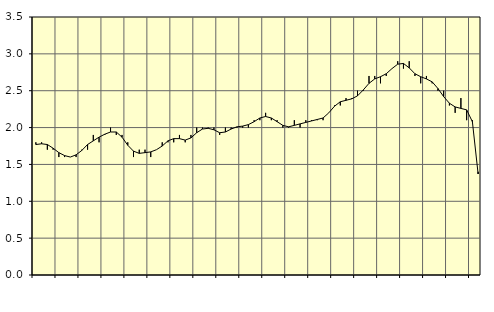
| Category | Piggar | Series 1 |
|---|---|---|
| nan | 1.8 | 1.77 |
| 1.0 | 1.8 | 1.78 |
| 1.0 | 1.7 | 1.77 |
| 1.0 | 1.7 | 1.72 |
| nan | 1.6 | 1.66 |
| 2.0 | 1.6 | 1.62 |
| 2.0 | 1.6 | 1.6 |
| 2.0 | 1.6 | 1.63 |
| nan | 1.7 | 1.69 |
| 3.0 | 1.7 | 1.77 |
| 3.0 | 1.9 | 1.82 |
| 3.0 | 1.8 | 1.87 |
| nan | 1.9 | 1.91 |
| 4.0 | 2 | 1.94 |
| 4.0 | 1.9 | 1.94 |
| 4.0 | 1.9 | 1.87 |
| nan | 1.8 | 1.76 |
| 5.0 | 1.6 | 1.68 |
| 5.0 | 1.7 | 1.65 |
| 5.0 | 1.7 | 1.66 |
| nan | 1.6 | 1.67 |
| 6.0 | 1.7 | 1.7 |
| 6.0 | 1.8 | 1.75 |
| 6.0 | 1.8 | 1.82 |
| nan | 1.8 | 1.85 |
| 7.0 | 1.9 | 1.85 |
| 7.0 | 1.8 | 1.83 |
| 7.0 | 1.9 | 1.86 |
| nan | 2 | 1.93 |
| 8.0 | 2 | 1.98 |
| 8.0 | 2 | 1.99 |
| 8.0 | 2 | 1.97 |
| nan | 1.9 | 1.93 |
| 9.0 | 2 | 1.94 |
| 9.0 | 2 | 1.98 |
| 9.0 | 2 | 2.01 |
| nan | 2 | 2.02 |
| 10.0 | 2 | 2.04 |
| 10.0 | 2.1 | 2.08 |
| 10.0 | 2.1 | 2.13 |
| nan | 2.2 | 2.15 |
| 11.0 | 2.1 | 2.13 |
| 11.0 | 2.1 | 2.08 |
| 11.0 | 2 | 2.03 |
| nan | 2 | 2.01 |
| 12.0 | 2.1 | 2.03 |
| 12.0 | 2 | 2.05 |
| 12.0 | 2.1 | 2.07 |
| nan | 2.1 | 2.09 |
| 13.0 | 2.1 | 2.11 |
| 13.0 | 2.1 | 2.13 |
| 13.0 | 2.2 | 2.2 |
| nan | 2.3 | 2.29 |
| 14.0 | 2.3 | 2.35 |
| 14.0 | 2.4 | 2.37 |
| 14.0 | 2.4 | 2.39 |
| nan | 2.5 | 2.43 |
| 15.0 | 2.5 | 2.51 |
| 15.0 | 2.7 | 2.6 |
| 15.0 | 2.7 | 2.66 |
| nan | 2.6 | 2.69 |
| 16.0 | 2.7 | 2.73 |
| 16.0 | 2.8 | 2.8 |
| 16.0 | 2.9 | 2.86 |
| nan | 2.8 | 2.87 |
| 17.0 | 2.9 | 2.81 |
| 17.0 | 2.7 | 2.73 |
| 17.0 | 2.6 | 2.69 |
| nan | 2.7 | 2.66 |
| 18.0 | 2.6 | 2.62 |
| 18.0 | 2.5 | 2.53 |
| 18.0 | 2.5 | 2.42 |
| nan | 2.3 | 2.33 |
| 19.0 | 2.2 | 2.28 |
| 19.0 | 2.4 | 2.26 |
| 19.0 | 2.1 | 2.24 |
| nan | 2.1 | 2.08 |
| 20.0 | 1.4 | 1.37 |